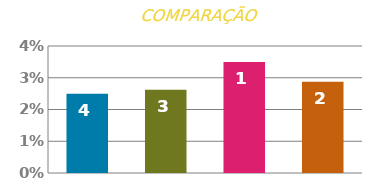
| Category | TAXA |
|---|---|
| 0 | 0.025 |
| 1 | 0.026 |
| 2 | 0.035 |
| 3 | 0.029 |